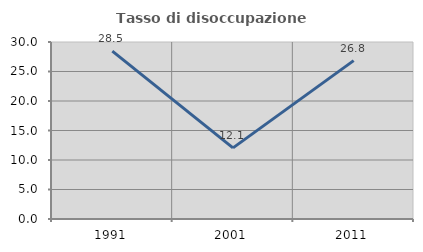
| Category | Tasso di disoccupazione giovanile  |
|---|---|
| 1991.0 | 28.455 |
| 2001.0 | 12.054 |
| 2011.0 | 26.842 |